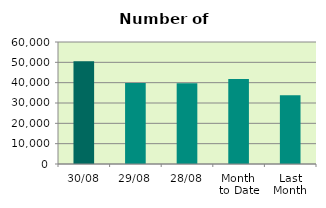
| Category | Series 0 |
|---|---|
| 30/08 | 50506 |
| 29/08 | 39866 |
| 28/08 | 39758 |
| Month 
to Date | 41849.545 |
| Last
Month | 33803.652 |